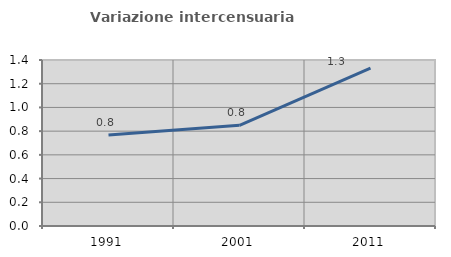
| Category | Variazione intercensuaria annua |
|---|---|
| 1991.0 | 0.767 |
| 2001.0 | 0.849 |
| 2011.0 | 1.331 |